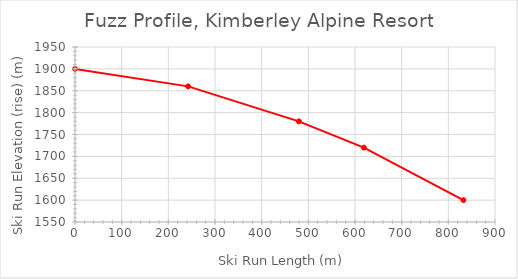
| Category | Series 0 |
|---|---|
| 0.0 | 1900 |
| 242.5 | 1860 |
| 479.7 | 1780 |
| 619.0 | 1720 |
| 832.3 | 1600 |